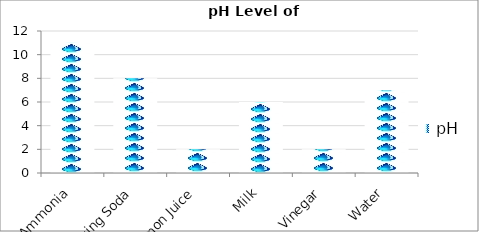
| Category | pH |
|---|---|
| Ammonia | 11 |
| Baking Soda | 8 |
| Lemon Juice | 2 |
| Milk | 6 |
| Vinegar | 2 |
| Water | 7 |